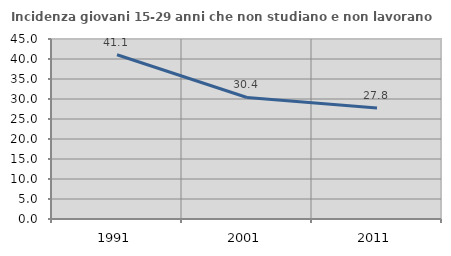
| Category | Incidenza giovani 15-29 anni che non studiano e non lavorano  |
|---|---|
| 1991.0 | 41.065 |
| 2001.0 | 30.38 |
| 2011.0 | 27.778 |